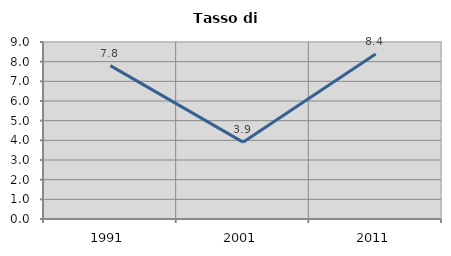
| Category | Tasso di disoccupazione   |
|---|---|
| 1991.0 | 7.799 |
| 2001.0 | 3.907 |
| 2011.0 | 8.39 |